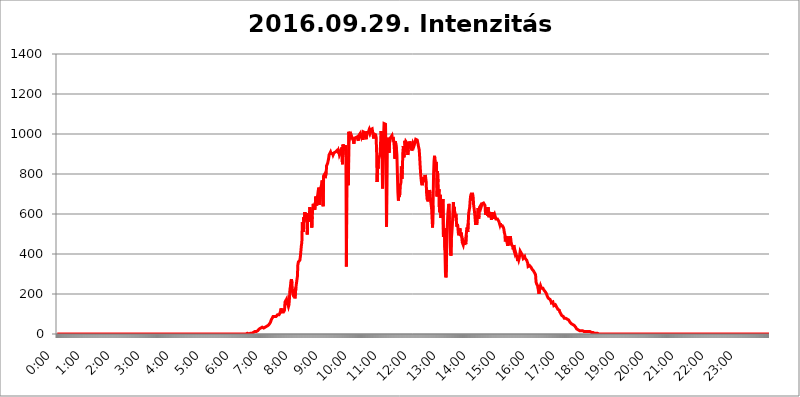
| Category | 2016.09.29. Intenzitás [W/m^2] |
|---|---|
| 0.0 | 0 |
| 0.0006944444444444445 | 0 |
| 0.001388888888888889 | 0 |
| 0.0020833333333333333 | 0 |
| 0.002777777777777778 | 0 |
| 0.003472222222222222 | 0 |
| 0.004166666666666667 | 0 |
| 0.004861111111111111 | 0 |
| 0.005555555555555556 | 0 |
| 0.0062499999999999995 | 0 |
| 0.006944444444444444 | 0 |
| 0.007638888888888889 | 0 |
| 0.008333333333333333 | 0 |
| 0.009027777777777779 | 0 |
| 0.009722222222222222 | 0 |
| 0.010416666666666666 | 0 |
| 0.011111111111111112 | 0 |
| 0.011805555555555555 | 0 |
| 0.012499999999999999 | 0 |
| 0.013194444444444444 | 0 |
| 0.013888888888888888 | 0 |
| 0.014583333333333332 | 0 |
| 0.015277777777777777 | 0 |
| 0.015972222222222224 | 0 |
| 0.016666666666666666 | 0 |
| 0.017361111111111112 | 0 |
| 0.018055555555555557 | 0 |
| 0.01875 | 0 |
| 0.019444444444444445 | 0 |
| 0.02013888888888889 | 0 |
| 0.020833333333333332 | 0 |
| 0.02152777777777778 | 0 |
| 0.022222222222222223 | 0 |
| 0.02291666666666667 | 0 |
| 0.02361111111111111 | 0 |
| 0.024305555555555556 | 0 |
| 0.024999999999999998 | 0 |
| 0.025694444444444447 | 0 |
| 0.02638888888888889 | 0 |
| 0.027083333333333334 | 0 |
| 0.027777777777777776 | 0 |
| 0.02847222222222222 | 0 |
| 0.029166666666666664 | 0 |
| 0.029861111111111113 | 0 |
| 0.030555555555555555 | 0 |
| 0.03125 | 0 |
| 0.03194444444444445 | 0 |
| 0.03263888888888889 | 0 |
| 0.03333333333333333 | 0 |
| 0.034027777777777775 | 0 |
| 0.034722222222222224 | 0 |
| 0.035416666666666666 | 0 |
| 0.036111111111111115 | 0 |
| 0.03680555555555556 | 0 |
| 0.0375 | 0 |
| 0.03819444444444444 | 0 |
| 0.03888888888888889 | 0 |
| 0.03958333333333333 | 0 |
| 0.04027777777777778 | 0 |
| 0.04097222222222222 | 0 |
| 0.041666666666666664 | 0 |
| 0.042361111111111106 | 0 |
| 0.04305555555555556 | 0 |
| 0.043750000000000004 | 0 |
| 0.044444444444444446 | 0 |
| 0.04513888888888889 | 0 |
| 0.04583333333333334 | 0 |
| 0.04652777777777778 | 0 |
| 0.04722222222222222 | 0 |
| 0.04791666666666666 | 0 |
| 0.04861111111111111 | 0 |
| 0.049305555555555554 | 0 |
| 0.049999999999999996 | 0 |
| 0.05069444444444445 | 0 |
| 0.051388888888888894 | 0 |
| 0.052083333333333336 | 0 |
| 0.05277777777777778 | 0 |
| 0.05347222222222222 | 0 |
| 0.05416666666666667 | 0 |
| 0.05486111111111111 | 0 |
| 0.05555555555555555 | 0 |
| 0.05625 | 0 |
| 0.05694444444444444 | 0 |
| 0.057638888888888885 | 0 |
| 0.05833333333333333 | 0 |
| 0.05902777777777778 | 0 |
| 0.059722222222222225 | 0 |
| 0.06041666666666667 | 0 |
| 0.061111111111111116 | 0 |
| 0.06180555555555556 | 0 |
| 0.0625 | 0 |
| 0.06319444444444444 | 0 |
| 0.06388888888888888 | 0 |
| 0.06458333333333334 | 0 |
| 0.06527777777777778 | 0 |
| 0.06597222222222222 | 0 |
| 0.06666666666666667 | 0 |
| 0.06736111111111111 | 0 |
| 0.06805555555555555 | 0 |
| 0.06874999999999999 | 0 |
| 0.06944444444444443 | 0 |
| 0.07013888888888889 | 0 |
| 0.07083333333333333 | 0 |
| 0.07152777777777779 | 0 |
| 0.07222222222222223 | 0 |
| 0.07291666666666667 | 0 |
| 0.07361111111111111 | 0 |
| 0.07430555555555556 | 0 |
| 0.075 | 0 |
| 0.07569444444444444 | 0 |
| 0.0763888888888889 | 0 |
| 0.07708333333333334 | 0 |
| 0.07777777777777778 | 0 |
| 0.07847222222222222 | 0 |
| 0.07916666666666666 | 0 |
| 0.0798611111111111 | 0 |
| 0.08055555555555556 | 0 |
| 0.08125 | 0 |
| 0.08194444444444444 | 0 |
| 0.08263888888888889 | 0 |
| 0.08333333333333333 | 0 |
| 0.08402777777777777 | 0 |
| 0.08472222222222221 | 0 |
| 0.08541666666666665 | 0 |
| 0.08611111111111112 | 0 |
| 0.08680555555555557 | 0 |
| 0.08750000000000001 | 0 |
| 0.08819444444444445 | 0 |
| 0.08888888888888889 | 0 |
| 0.08958333333333333 | 0 |
| 0.09027777777777778 | 0 |
| 0.09097222222222222 | 0 |
| 0.09166666666666667 | 0 |
| 0.09236111111111112 | 0 |
| 0.09305555555555556 | 0 |
| 0.09375 | 0 |
| 0.09444444444444444 | 0 |
| 0.09513888888888888 | 0 |
| 0.09583333333333333 | 0 |
| 0.09652777777777777 | 0 |
| 0.09722222222222222 | 0 |
| 0.09791666666666667 | 0 |
| 0.09861111111111111 | 0 |
| 0.09930555555555555 | 0 |
| 0.09999999999999999 | 0 |
| 0.10069444444444443 | 0 |
| 0.1013888888888889 | 0 |
| 0.10208333333333335 | 0 |
| 0.10277777777777779 | 0 |
| 0.10347222222222223 | 0 |
| 0.10416666666666667 | 0 |
| 0.10486111111111111 | 0 |
| 0.10555555555555556 | 0 |
| 0.10625 | 0 |
| 0.10694444444444444 | 0 |
| 0.1076388888888889 | 0 |
| 0.10833333333333334 | 0 |
| 0.10902777777777778 | 0 |
| 0.10972222222222222 | 0 |
| 0.1111111111111111 | 0 |
| 0.11180555555555556 | 0 |
| 0.11180555555555556 | 0 |
| 0.1125 | 0 |
| 0.11319444444444444 | 0 |
| 0.11388888888888889 | 0 |
| 0.11458333333333333 | 0 |
| 0.11527777777777777 | 0 |
| 0.11597222222222221 | 0 |
| 0.11666666666666665 | 0 |
| 0.1173611111111111 | 0 |
| 0.11805555555555557 | 0 |
| 0.11944444444444445 | 0 |
| 0.12013888888888889 | 0 |
| 0.12083333333333333 | 0 |
| 0.12152777777777778 | 0 |
| 0.12222222222222223 | 0 |
| 0.12291666666666667 | 0 |
| 0.12291666666666667 | 0 |
| 0.12361111111111112 | 0 |
| 0.12430555555555556 | 0 |
| 0.125 | 0 |
| 0.12569444444444444 | 0 |
| 0.12638888888888888 | 0 |
| 0.12708333333333333 | 0 |
| 0.16875 | 0 |
| 0.12847222222222224 | 0 |
| 0.12916666666666668 | 0 |
| 0.12986111111111112 | 0 |
| 0.13055555555555556 | 0 |
| 0.13125 | 0 |
| 0.13194444444444445 | 0 |
| 0.1326388888888889 | 0 |
| 0.13333333333333333 | 0 |
| 0.13402777777777777 | 0 |
| 0.13402777777777777 | 0 |
| 0.13472222222222222 | 0 |
| 0.13541666666666666 | 0 |
| 0.1361111111111111 | 0 |
| 0.13749999999999998 | 0 |
| 0.13819444444444443 | 0 |
| 0.1388888888888889 | 0 |
| 0.13958333333333334 | 0 |
| 0.14027777777777778 | 0 |
| 0.14097222222222222 | 0 |
| 0.14166666666666666 | 0 |
| 0.1423611111111111 | 0 |
| 0.14305555555555557 | 0 |
| 0.14375000000000002 | 0 |
| 0.14444444444444446 | 0 |
| 0.1451388888888889 | 0 |
| 0.1451388888888889 | 0 |
| 0.14652777777777778 | 0 |
| 0.14722222222222223 | 0 |
| 0.14791666666666667 | 0 |
| 0.1486111111111111 | 0 |
| 0.14930555555555555 | 0 |
| 0.15 | 0 |
| 0.15069444444444444 | 0 |
| 0.15138888888888888 | 0 |
| 0.15208333333333332 | 0 |
| 0.15277777777777776 | 0 |
| 0.15347222222222223 | 0 |
| 0.15416666666666667 | 0 |
| 0.15486111111111112 | 0 |
| 0.15555555555555556 | 0 |
| 0.15625 | 0 |
| 0.15694444444444444 | 0 |
| 0.15763888888888888 | 0 |
| 0.15833333333333333 | 0 |
| 0.15902777777777777 | 0 |
| 0.15972222222222224 | 0 |
| 0.16041666666666668 | 0 |
| 0.16111111111111112 | 0 |
| 0.16180555555555556 | 0 |
| 0.1625 | 0 |
| 0.16319444444444445 | 0 |
| 0.1638888888888889 | 0 |
| 0.16458333333333333 | 0 |
| 0.16527777777777777 | 0 |
| 0.16597222222222222 | 0 |
| 0.16666666666666666 | 0 |
| 0.1673611111111111 | 0 |
| 0.16805555555555554 | 0 |
| 0.16874999999999998 | 0 |
| 0.16944444444444443 | 0 |
| 0.17013888888888887 | 0 |
| 0.1708333333333333 | 0 |
| 0.17152777777777775 | 0 |
| 0.17222222222222225 | 0 |
| 0.1729166666666667 | 0 |
| 0.17361111111111113 | 0 |
| 0.17430555555555557 | 0 |
| 0.17500000000000002 | 0 |
| 0.17569444444444446 | 0 |
| 0.1763888888888889 | 0 |
| 0.17708333333333334 | 0 |
| 0.17777777777777778 | 0 |
| 0.17847222222222223 | 0 |
| 0.17916666666666667 | 0 |
| 0.1798611111111111 | 0 |
| 0.18055555555555555 | 0 |
| 0.18125 | 0 |
| 0.18194444444444444 | 0 |
| 0.1826388888888889 | 0 |
| 0.18333333333333335 | 0 |
| 0.1840277777777778 | 0 |
| 0.18472222222222223 | 0 |
| 0.18541666666666667 | 0 |
| 0.18611111111111112 | 0 |
| 0.18680555555555556 | 0 |
| 0.1875 | 0 |
| 0.18819444444444444 | 0 |
| 0.18888888888888888 | 0 |
| 0.18958333333333333 | 0 |
| 0.19027777777777777 | 0 |
| 0.1909722222222222 | 0 |
| 0.19166666666666665 | 0 |
| 0.19236111111111112 | 0 |
| 0.19305555555555554 | 0 |
| 0.19375 | 0 |
| 0.19444444444444445 | 0 |
| 0.1951388888888889 | 0 |
| 0.19583333333333333 | 0 |
| 0.19652777777777777 | 0 |
| 0.19722222222222222 | 0 |
| 0.19791666666666666 | 0 |
| 0.1986111111111111 | 0 |
| 0.19930555555555554 | 0 |
| 0.19999999999999998 | 0 |
| 0.20069444444444443 | 0 |
| 0.20138888888888887 | 0 |
| 0.2020833333333333 | 0 |
| 0.2027777777777778 | 0 |
| 0.2034722222222222 | 0 |
| 0.2041666666666667 | 0 |
| 0.20486111111111113 | 0 |
| 0.20555555555555557 | 0 |
| 0.20625000000000002 | 0 |
| 0.20694444444444446 | 0 |
| 0.2076388888888889 | 0 |
| 0.20833333333333334 | 0 |
| 0.20902777777777778 | 0 |
| 0.20972222222222223 | 0 |
| 0.21041666666666667 | 0 |
| 0.2111111111111111 | 0 |
| 0.21180555555555555 | 0 |
| 0.2125 | 0 |
| 0.21319444444444444 | 0 |
| 0.2138888888888889 | 0 |
| 0.21458333333333335 | 0 |
| 0.2152777777777778 | 0 |
| 0.21597222222222223 | 0 |
| 0.21666666666666667 | 0 |
| 0.21736111111111112 | 0 |
| 0.21805555555555556 | 0 |
| 0.21875 | 0 |
| 0.21944444444444444 | 0 |
| 0.22013888888888888 | 0 |
| 0.22083333333333333 | 0 |
| 0.22152777777777777 | 0 |
| 0.2222222222222222 | 0 |
| 0.22291666666666665 | 0 |
| 0.2236111111111111 | 0 |
| 0.22430555555555556 | 0 |
| 0.225 | 0 |
| 0.22569444444444445 | 0 |
| 0.2263888888888889 | 0 |
| 0.22708333333333333 | 0 |
| 0.22777777777777777 | 0 |
| 0.22847222222222222 | 0 |
| 0.22916666666666666 | 0 |
| 0.2298611111111111 | 0 |
| 0.23055555555555554 | 0 |
| 0.23124999999999998 | 0 |
| 0.23194444444444443 | 0 |
| 0.23263888888888887 | 0 |
| 0.2333333333333333 | 0 |
| 0.2340277777777778 | 0 |
| 0.2347222222222222 | 0 |
| 0.2354166666666667 | 0 |
| 0.23611111111111113 | 0 |
| 0.23680555555555557 | 0 |
| 0.23750000000000002 | 0 |
| 0.23819444444444446 | 0 |
| 0.2388888888888889 | 0 |
| 0.23958333333333334 | 0 |
| 0.24027777777777778 | 0 |
| 0.24097222222222223 | 0 |
| 0.24166666666666667 | 0 |
| 0.2423611111111111 | 0 |
| 0.24305555555555555 | 0 |
| 0.24375 | 0 |
| 0.24444444444444446 | 0 |
| 0.24513888888888888 | 0 |
| 0.24583333333333335 | 0 |
| 0.2465277777777778 | 0 |
| 0.24722222222222223 | 0 |
| 0.24791666666666667 | 0 |
| 0.24861111111111112 | 0 |
| 0.24930555555555556 | 0 |
| 0.25 | 0 |
| 0.25069444444444444 | 0 |
| 0.2513888888888889 | 0 |
| 0.2520833333333333 | 0 |
| 0.25277777777777777 | 0 |
| 0.2534722222222222 | 0 |
| 0.25416666666666665 | 0 |
| 0.2548611111111111 | 0 |
| 0.2555555555555556 | 0 |
| 0.25625000000000003 | 0 |
| 0.2569444444444445 | 0 |
| 0.2576388888888889 | 0 |
| 0.25833333333333336 | 0 |
| 0.2590277777777778 | 0 |
| 0.25972222222222224 | 0 |
| 0.2604166666666667 | 0 |
| 0.2611111111111111 | 0 |
| 0.26180555555555557 | 0 |
| 0.2625 | 0 |
| 0.26319444444444445 | 0 |
| 0.2638888888888889 | 0 |
| 0.26458333333333334 | 0 |
| 0.2652777777777778 | 0 |
| 0.2659722222222222 | 0 |
| 0.26666666666666666 | 3.525 |
| 0.2673611111111111 | 0 |
| 0.26805555555555555 | 0 |
| 0.26875 | 0 |
| 0.26944444444444443 | 0 |
| 0.2701388888888889 | 3.525 |
| 0.2708333333333333 | 3.525 |
| 0.27152777777777776 | 3.525 |
| 0.2722222222222222 | 3.525 |
| 0.27291666666666664 | 3.525 |
| 0.2736111111111111 | 3.525 |
| 0.2743055555555555 | 7.887 |
| 0.27499999999999997 | 7.887 |
| 0.27569444444444446 | 7.887 |
| 0.27638888888888885 | 12.257 |
| 0.27708333333333335 | 12.257 |
| 0.2777777777777778 | 12.257 |
| 0.27847222222222223 | 12.257 |
| 0.2791666666666667 | 12.257 |
| 0.2798611111111111 | 16.636 |
| 0.28055555555555556 | 16.636 |
| 0.28125 | 16.636 |
| 0.28194444444444444 | 16.636 |
| 0.2826388888888889 | 21.024 |
| 0.2833333333333333 | 25.419 |
| 0.28402777777777777 | 25.419 |
| 0.2847222222222222 | 25.419 |
| 0.28541666666666665 | 29.823 |
| 0.28611111111111115 | 29.823 |
| 0.28680555555555554 | 29.823 |
| 0.28750000000000003 | 34.234 |
| 0.2881944444444445 | 34.234 |
| 0.2888888888888889 | 29.823 |
| 0.28958333333333336 | 29.823 |
| 0.2902777777777778 | 29.823 |
| 0.29097222222222224 | 29.823 |
| 0.2916666666666667 | 34.234 |
| 0.2923611111111111 | 34.234 |
| 0.29305555555555557 | 34.234 |
| 0.29375 | 38.653 |
| 0.29444444444444445 | 38.653 |
| 0.2951388888888889 | 43.079 |
| 0.29583333333333334 | 43.079 |
| 0.2965277777777778 | 47.511 |
| 0.2972222222222222 | 47.511 |
| 0.29791666666666666 | 51.951 |
| 0.2986111111111111 | 56.398 |
| 0.29930555555555555 | 60.85 |
| 0.3 | 69.775 |
| 0.30069444444444443 | 74.246 |
| 0.3013888888888889 | 78.722 |
| 0.3020833333333333 | 83.205 |
| 0.30277777777777776 | 87.692 |
| 0.3034722222222222 | 83.205 |
| 0.30416666666666664 | 83.205 |
| 0.3048611111111111 | 87.692 |
| 0.3055555555555555 | 83.205 |
| 0.30624999999999997 | 83.205 |
| 0.3069444444444444 | 87.692 |
| 0.3076388888888889 | 87.692 |
| 0.30833333333333335 | 92.184 |
| 0.3090277777777778 | 96.682 |
| 0.30972222222222223 | 101.184 |
| 0.3104166666666667 | 96.682 |
| 0.3111111111111111 | 96.682 |
| 0.31180555555555556 | 96.682 |
| 0.3125 | 105.69 |
| 0.31319444444444444 | 114.716 |
| 0.3138888888888889 | 128.284 |
| 0.3145833333333333 | 128.284 |
| 0.31527777777777777 | 110.201 |
| 0.3159722222222222 | 105.69 |
| 0.31666666666666665 | 110.201 |
| 0.31736111111111115 | 110.201 |
| 0.31805555555555554 | 110.201 |
| 0.31875000000000003 | 119.235 |
| 0.3194444444444445 | 160.056 |
| 0.3201388888888889 | 160.056 |
| 0.32083333333333336 | 164.605 |
| 0.3215277777777778 | 173.709 |
| 0.32222222222222224 | 155.509 |
| 0.3229166666666667 | 155.509 |
| 0.3236111111111111 | 146.423 |
| 0.32430555555555557 | 137.347 |
| 0.325 | 146.423 |
| 0.32569444444444445 | 178.264 |
| 0.3263888888888889 | 223.873 |
| 0.32708333333333334 | 237.564 |
| 0.3277777777777778 | 264.932 |
| 0.3284722222222222 | 274.047 |
| 0.32916666666666666 | 255.813 |
| 0.3298611111111111 | 210.182 |
| 0.33055555555555555 | 201.058 |
| 0.33125 | 205.62 |
| 0.33194444444444443 | 210.182 |
| 0.3326388888888889 | 196.497 |
| 0.3333333333333333 | 178.264 |
| 0.3340277777777778 | 173.709 |
| 0.3347222222222222 | 233 |
| 0.3354166666666667 | 228.436 |
| 0.3361111111111111 | 228.436 |
| 0.3368055555555556 | 287.709 |
| 0.33749999999999997 | 346.682 |
| 0.33819444444444446 | 360.221 |
| 0.33888888888888885 | 355.712 |
| 0.33958333333333335 | 355.712 |
| 0.34027777777777773 | 369.23 |
| 0.34097222222222223 | 387.202 |
| 0.3416666666666666 | 387.202 |
| 0.3423611111111111 | 440.702 |
| 0.3430555555555555 | 458.38 |
| 0.34375 | 558.261 |
| 0.3444444444444445 | 558.261 |
| 0.3451388888888889 | 510.885 |
| 0.3458333333333334 | 583.779 |
| 0.34652777777777777 | 562.53 |
| 0.34722222222222227 | 609.062 |
| 0.34791666666666665 | 609.062 |
| 0.34861111111111115 | 583.779 |
| 0.34930555555555554 | 600.661 |
| 0.35000000000000003 | 579.542 |
| 0.3506944444444444 | 497.836 |
| 0.3513888888888889 | 604.864 |
| 0.3520833333333333 | 609.062 |
| 0.3527777777777778 | 562.53 |
| 0.3534722222222222 | 571.049 |
| 0.3541666666666667 | 634.105 |
| 0.3548611111111111 | 617.436 |
| 0.35555555555555557 | 583.779 |
| 0.35625 | 592.233 |
| 0.35694444444444445 | 532.513 |
| 0.3576388888888889 | 588.009 |
| 0.35833333333333334 | 625.784 |
| 0.3590277777777778 | 650.667 |
| 0.3597222222222222 | 638.256 |
| 0.36041666666666666 | 650.667 |
| 0.3611111111111111 | 621.613 |
| 0.36180555555555555 | 646.537 |
| 0.3625 | 687.544 |
| 0.36319444444444443 | 683.473 |
| 0.3638888888888889 | 642.4 |
| 0.3645833333333333 | 679.395 |
| 0.3652777777777778 | 695.666 |
| 0.3659722222222222 | 691.608 |
| 0.3666666666666667 | 731.896 |
| 0.3673611111111111 | 727.896 |
| 0.3680555555555556 | 646.537 |
| 0.36874999999999997 | 711.832 |
| 0.36944444444444446 | 727.896 |
| 0.37013888888888885 | 727.896 |
| 0.37083333333333335 | 747.834 |
| 0.37152777777777773 | 767.62 |
| 0.37222222222222223 | 687.544 |
| 0.3729166666666666 | 638.256 |
| 0.3736111111111111 | 791.169 |
| 0.3743055555555555 | 791.169 |
| 0.375 | 798.974 |
| 0.3756944444444445 | 779.42 |
| 0.3763888888888889 | 791.169 |
| 0.3770833333333334 | 798.974 |
| 0.37777777777777777 | 841.526 |
| 0.37847222222222227 | 837.682 |
| 0.37916666666666665 | 853.029 |
| 0.37986111111111115 | 864.493 |
| 0.38055555555555554 | 875.918 |
| 0.38125000000000003 | 894.885 |
| 0.3819444444444444 | 898.668 |
| 0.3826388888888889 | 898.668 |
| 0.3833333333333333 | 909.996 |
| 0.3840277777777778 | 902.447 |
| 0.3847222222222222 | 902.447 |
| 0.3854166666666667 | 898.668 |
| 0.3861111111111111 | 902.447 |
| 0.38680555555555557 | 894.885 |
| 0.3875 | 898.668 |
| 0.38819444444444445 | 906.223 |
| 0.3888888888888889 | 902.447 |
| 0.38958333333333334 | 909.996 |
| 0.3902777777777778 | 909.996 |
| 0.3909722222222222 | 909.996 |
| 0.39166666666666666 | 913.766 |
| 0.3923611111111111 | 917.534 |
| 0.39305555555555555 | 913.766 |
| 0.39375 | 909.996 |
| 0.39444444444444443 | 917.534 |
| 0.3951388888888889 | 909.996 |
| 0.3958333333333333 | 894.885 |
| 0.3965277777777778 | 898.668 |
| 0.3972222222222222 | 906.223 |
| 0.3979166666666667 | 913.766 |
| 0.3986111111111111 | 925.06 |
| 0.3993055555555556 | 932.576 |
| 0.39999999999999997 | 849.199 |
| 0.40069444444444446 | 947.58 |
| 0.40138888888888885 | 943.832 |
| 0.40208333333333335 | 932.576 |
| 0.40277777777777773 | 917.534 |
| 0.40347222222222223 | 925.06 |
| 0.4041666666666666 | 943.832 |
| 0.4048611111111111 | 894.885 |
| 0.4055555555555555 | 337.639 |
| 0.40625 | 887.309 |
| 0.4069444444444445 | 810.641 |
| 0.4076388888888889 | 755.766 |
| 0.4083333333333334 | 743.859 |
| 0.40902777777777777 | 1011.118 |
| 0.40972222222222227 | 999.916 |
| 0.41041666666666665 | 1003.65 |
| 0.41111111111111115 | 992.448 |
| 0.41180555555555554 | 984.98 |
| 0.41250000000000003 | 992.448 |
| 0.4131944444444444 | 984.98 |
| 0.4138888888888889 | 984.98 |
| 0.4145833333333333 | 977.508 |
| 0.4152777777777778 | 970.034 |
| 0.4159722222222222 | 951.327 |
| 0.4166666666666667 | 973.772 |
| 0.4173611111111111 | 977.508 |
| 0.41805555555555557 | 981.244 |
| 0.41875 | 981.244 |
| 0.41944444444444445 | 977.508 |
| 0.4201388888888889 | 984.98 |
| 0.42083333333333334 | 981.244 |
| 0.4215277777777778 | 988.714 |
| 0.4222222222222222 | 966.295 |
| 0.42291666666666666 | 992.448 |
| 0.4236111111111111 | 996.182 |
| 0.42430555555555555 | 996.182 |
| 0.425 | 1003.65 |
| 0.42569444444444443 | 992.448 |
| 0.4263888888888889 | 984.98 |
| 0.4270833333333333 | 988.714 |
| 0.4277777777777778 | 1003.65 |
| 0.4284722222222222 | 970.034 |
| 0.4291666666666667 | 1011.118 |
| 0.4298611111111111 | 1007.383 |
| 0.4305555555555556 | 1007.383 |
| 0.43124999999999997 | 1007.383 |
| 0.43194444444444446 | 1007.383 |
| 0.43263888888888885 | 1011.118 |
| 0.43333333333333335 | 973.772 |
| 0.43402777777777773 | 1007.383 |
| 0.43472222222222223 | 1007.383 |
| 0.4354166666666666 | 1003.65 |
| 0.4361111111111111 | 1007.383 |
| 0.4368055555555555 | 1014.852 |
| 0.4375 | 1007.383 |
| 0.4381944444444445 | 1018.587 |
| 0.4388888888888889 | 1011.118 |
| 0.4395833333333334 | 1022.323 |
| 0.44027777777777777 | 1026.06 |
| 0.44097222222222227 | 1022.323 |
| 0.44166666666666665 | 1026.06 |
| 0.44236111111111115 | 1026.06 |
| 0.44305555555555554 | 1022.323 |
| 0.44375000000000003 | 977.508 |
| 0.4444444444444444 | 999.916 |
| 0.4451388888888889 | 1003.65 |
| 0.4458333333333333 | 996.182 |
| 0.4465277777777778 | 996.182 |
| 0.4472222222222222 | 984.98 |
| 0.4479166666666667 | 913.766 |
| 0.4486111111111111 | 759.723 |
| 0.44930555555555557 | 837.682 |
| 0.45 | 826.123 |
| 0.45069444444444445 | 875.918 |
| 0.4513888888888889 | 883.516 |
| 0.45208333333333334 | 887.309 |
| 0.4527777777777778 | 898.668 |
| 0.4534722222222222 | 955.071 |
| 0.45416666666666666 | 1014.852 |
| 0.4548611111111111 | 988.714 |
| 0.45555555555555555 | 883.516 |
| 0.45625 | 727.896 |
| 0.45694444444444443 | 928.819 |
| 0.4576388888888889 | 981.244 |
| 0.4583333333333333 | 1052.255 |
| 0.4590277777777778 | 1052.255 |
| 0.4597222222222222 | 1052.255 |
| 0.4604166666666667 | 1048.508 |
| 0.4611111111111111 | 856.855 |
| 0.4618055555555556 | 536.82 |
| 0.46249999999999997 | 906.223 |
| 0.46319444444444446 | 977.508 |
| 0.46388888888888885 | 917.534 |
| 0.46458333333333335 | 981.244 |
| 0.46527777777777773 | 906.223 |
| 0.46597222222222223 | 955.071 |
| 0.4666666666666666 | 962.555 |
| 0.4673611111111111 | 981.244 |
| 0.4680555555555555 | 984.98 |
| 0.46875 | 977.508 |
| 0.4694444444444445 | 992.448 |
| 0.4701388888888889 | 973.772 |
| 0.4708333333333334 | 984.98 |
| 0.47152777777777777 | 981.244 |
| 0.47222222222222227 | 958.814 |
| 0.47291666666666665 | 921.298 |
| 0.47361111111111115 | 875.918 |
| 0.47430555555555554 | 962.555 |
| 0.47500000000000003 | 962.555 |
| 0.4756944444444444 | 925.06 |
| 0.4763888888888889 | 894.885 |
| 0.4770833333333333 | 798.974 |
| 0.4777777777777778 | 707.8 |
| 0.4784722222222222 | 667.123 |
| 0.4791666666666667 | 699.717 |
| 0.4798611111111111 | 687.544 |
| 0.48055555555555557 | 703.762 |
| 0.48125 | 743.859 |
| 0.48194444444444445 | 755.766 |
| 0.4826388888888889 | 837.682 |
| 0.48333333333333334 | 775.492 |
| 0.4840277777777778 | 822.26 |
| 0.4847222222222222 | 906.223 |
| 0.48541666666666666 | 940.082 |
| 0.4861111111111111 | 883.516 |
| 0.48680555555555555 | 902.447 |
| 0.4875 | 966.295 |
| 0.48819444444444443 | 947.58 |
| 0.4888888888888889 | 962.555 |
| 0.4895833333333333 | 962.555 |
| 0.4902777777777778 | 955.071 |
| 0.4909722222222222 | 928.819 |
| 0.4916666666666667 | 894.885 |
| 0.4923611111111111 | 921.298 |
| 0.4930555555555556 | 951.327 |
| 0.49374999999999997 | 940.082 |
| 0.49444444444444446 | 962.555 |
| 0.49513888888888885 | 955.071 |
| 0.49583333333333335 | 943.832 |
| 0.49652777777777773 | 917.534 |
| 0.49722222222222223 | 925.06 |
| 0.4979166666666666 | 940.082 |
| 0.4986111111111111 | 951.327 |
| 0.4993055555555555 | 951.327 |
| 0.5 | 936.33 |
| 0.5006944444444444 | 943.832 |
| 0.5013888888888889 | 955.071 |
| 0.5020833333333333 | 951.327 |
| 0.5027777777777778 | 973.772 |
| 0.5034722222222222 | 973.772 |
| 0.5041666666666667 | 970.034 |
| 0.5048611111111111 | 970.034 |
| 0.5055555555555555 | 958.814 |
| 0.50625 | 955.071 |
| 0.5069444444444444 | 932.576 |
| 0.5076388888888889 | 921.298 |
| 0.5083333333333333 | 883.516 |
| 0.5090277777777777 | 837.682 |
| 0.5097222222222222 | 798.974 |
| 0.5104166666666666 | 771.559 |
| 0.5111111111111112 | 751.803 |
| 0.5118055555555555 | 743.859 |
| 0.5125000000000001 | 739.877 |
| 0.5131944444444444 | 747.834 |
| 0.513888888888889 | 783.342 |
| 0.5145833333333333 | 759.723 |
| 0.5152777777777778 | 759.723 |
| 0.5159722222222222 | 795.074 |
| 0.5166666666666667 | 783.342 |
| 0.517361111111111 | 763.674 |
| 0.5180555555555556 | 703.762 |
| 0.5187499999999999 | 675.311 |
| 0.5194444444444445 | 679.395 |
| 0.5201388888888888 | 663.019 |
| 0.5208333333333334 | 683.473 |
| 0.5215277777777778 | 687.544 |
| 0.5222222222222223 | 719.877 |
| 0.5229166666666667 | 703.762 |
| 0.5236111111111111 | 667.123 |
| 0.5243055555555556 | 671.22 |
| 0.525 | 629.948 |
| 0.5256944444444445 | 579.542 |
| 0.5263888888888889 | 532.513 |
| 0.5270833333333333 | 642.4 |
| 0.5277777777777778 | 795.074 |
| 0.5284722222222222 | 864.493 |
| 0.5291666666666667 | 891.099 |
| 0.5298611111111111 | 860.676 |
| 0.5305555555555556 | 849.199 |
| 0.53125 | 860.676 |
| 0.5319444444444444 | 845.365 |
| 0.5326388888888889 | 687.544 |
| 0.5333333333333333 | 814.519 |
| 0.5340277777777778 | 759.723 |
| 0.5347222222222222 | 707.8 |
| 0.5354166666666667 | 723.889 |
| 0.5361111111111111 | 609.062 |
| 0.5368055555555555 | 646.537 |
| 0.5375 | 695.666 |
| 0.5381944444444444 | 579.542 |
| 0.5388888888888889 | 667.123 |
| 0.5395833333333333 | 629.948 |
| 0.5402777777777777 | 650.667 |
| 0.5409722222222222 | 675.311 |
| 0.5416666666666666 | 484.735 |
| 0.5423611111111112 | 497.836 |
| 0.5430555555555555 | 528.2 |
| 0.5437500000000001 | 418.492 |
| 0.5444444444444444 | 305.898 |
| 0.545138888888889 | 283.156 |
| 0.5458333333333333 | 346.682 |
| 0.5465277777777778 | 497.836 |
| 0.5472222222222222 | 553.986 |
| 0.5479166666666667 | 604.864 |
| 0.548611111111111 | 629.948 |
| 0.5493055555555556 | 650.667 |
| 0.5499999999999999 | 575.299 |
| 0.5506944444444445 | 523.88 |
| 0.5513888888888888 | 431.833 |
| 0.5520833333333334 | 391.685 |
| 0.5527777777777778 | 475.972 |
| 0.5534722222222223 | 506.542 |
| 0.5541666666666667 | 545.416 |
| 0.5548611111111111 | 600.661 |
| 0.5555555555555556 | 658.909 |
| 0.55625 | 621.613 |
| 0.5569444444444445 | 634.105 |
| 0.5576388888888889 | 596.45 |
| 0.5583333333333333 | 583.779 |
| 0.5590277777777778 | 600.661 |
| 0.5597222222222222 | 566.793 |
| 0.5604166666666667 | 536.82 |
| 0.5611111111111111 | 549.704 |
| 0.5618055555555556 | 536.82 |
| 0.5625 | 506.542 |
| 0.5631944444444444 | 493.475 |
| 0.5638888888888889 | 493.475 |
| 0.5645833333333333 | 528.2 |
| 0.5652777777777778 | 515.223 |
| 0.5659722222222222 | 489.108 |
| 0.5666666666666667 | 506.542 |
| 0.5673611111111111 | 484.735 |
| 0.5680555555555555 | 458.38 |
| 0.56875 | 453.968 |
| 0.5694444444444444 | 445.129 |
| 0.5701388888888889 | 458.38 |
| 0.5708333333333333 | 458.38 |
| 0.5715277777777777 | 445.129 |
| 0.5722222222222222 | 467.187 |
| 0.5729166666666666 | 449.551 |
| 0.5736111111111112 | 493.475 |
| 0.5743055555555555 | 523.88 |
| 0.5750000000000001 | 532.513 |
| 0.5756944444444444 | 510.885 |
| 0.576388888888889 | 553.986 |
| 0.5770833333333333 | 604.864 |
| 0.5777777777777778 | 609.062 |
| 0.5784722222222222 | 634.105 |
| 0.5791666666666667 | 671.22 |
| 0.579861111111111 | 691.608 |
| 0.5805555555555556 | 699.717 |
| 0.5812499999999999 | 695.666 |
| 0.5819444444444445 | 703.762 |
| 0.5826388888888888 | 699.717 |
| 0.5833333333333334 | 683.473 |
| 0.5840277777777778 | 642.4 |
| 0.5847222222222223 | 625.784 |
| 0.5854166666666667 | 604.864 |
| 0.5861111111111111 | 600.661 |
| 0.5868055555555556 | 545.416 |
| 0.5875 | 583.779 |
| 0.5881944444444445 | 545.416 |
| 0.5888888888888889 | 562.53 |
| 0.5895833333333333 | 596.45 |
| 0.5902777777777778 | 629.948 |
| 0.5909722222222222 | 575.299 |
| 0.5916666666666667 | 592.233 |
| 0.5923611111111111 | 634.105 |
| 0.5930555555555556 | 634.105 |
| 0.59375 | 642.4 |
| 0.5944444444444444 | 634.105 |
| 0.5951388888888889 | 634.105 |
| 0.5958333333333333 | 650.667 |
| 0.5965277777777778 | 654.791 |
| 0.5972222222222222 | 654.791 |
| 0.5979166666666667 | 654.791 |
| 0.5986111111111111 | 654.791 |
| 0.5993055555555555 | 658.909 |
| 0.6 | 642.4 |
| 0.6006944444444444 | 596.45 |
| 0.6013888888888889 | 609.062 |
| 0.6020833333333333 | 634.105 |
| 0.6027777777777777 | 613.252 |
| 0.6034722222222222 | 592.233 |
| 0.6041666666666666 | 634.105 |
| 0.6048611111111112 | 604.864 |
| 0.6055555555555555 | 583.779 |
| 0.6062500000000001 | 609.062 |
| 0.6069444444444444 | 613.252 |
| 0.607638888888889 | 596.45 |
| 0.6083333333333333 | 583.779 |
| 0.6090277777777778 | 571.049 |
| 0.6097222222222222 | 609.062 |
| 0.6104166666666667 | 592.233 |
| 0.611111111111111 | 575.299 |
| 0.6118055555555556 | 592.233 |
| 0.6124999999999999 | 588.009 |
| 0.6131944444444445 | 600.661 |
| 0.6138888888888888 | 592.233 |
| 0.6145833333333334 | 588.009 |
| 0.6152777777777778 | 575.299 |
| 0.6159722222222223 | 575.299 |
| 0.6166666666666667 | 575.299 |
| 0.6173611111111111 | 575.299 |
| 0.6180555555555556 | 575.299 |
| 0.61875 | 571.049 |
| 0.6194444444444445 | 562.53 |
| 0.6201388888888889 | 562.53 |
| 0.6208333333333333 | 545.416 |
| 0.6215277777777778 | 553.986 |
| 0.6222222222222222 | 541.121 |
| 0.6229166666666667 | 541.121 |
| 0.6236111111111111 | 541.121 |
| 0.6243055555555556 | 541.121 |
| 0.625 | 536.82 |
| 0.6256944444444444 | 532.513 |
| 0.6263888888888889 | 523.88 |
| 0.6270833333333333 | 506.542 |
| 0.6277777777777778 | 497.836 |
| 0.6284722222222222 | 462.786 |
| 0.6291666666666667 | 489.108 |
| 0.6298611111111111 | 475.972 |
| 0.6305555555555555 | 480.356 |
| 0.63125 | 489.108 |
| 0.6319444444444444 | 440.702 |
| 0.6326388888888889 | 458.38 |
| 0.6333333333333333 | 462.786 |
| 0.6340277777777777 | 462.786 |
| 0.6347222222222222 | 453.968 |
| 0.6354166666666666 | 489.108 |
| 0.6361111111111112 | 471.582 |
| 0.6368055555555555 | 453.968 |
| 0.6375000000000001 | 445.129 |
| 0.6381944444444444 | 445.129 |
| 0.638888888888889 | 436.27 |
| 0.6395833333333333 | 422.943 |
| 0.6402777777777778 | 445.129 |
| 0.6409722222222222 | 414.035 |
| 0.6416666666666667 | 405.108 |
| 0.642361111111111 | 414.035 |
| 0.6430555555555556 | 409.574 |
| 0.6437499999999999 | 396.164 |
| 0.6444444444444445 | 387.202 |
| 0.6451388888888888 | 378.224 |
| 0.6458333333333334 | 364.728 |
| 0.6465277777777778 | 378.224 |
| 0.6472222222222223 | 369.23 |
| 0.6479166666666667 | 378.224 |
| 0.6486111111111111 | 373.729 |
| 0.6493055555555556 | 414.035 |
| 0.65 | 409.574 |
| 0.6506944444444445 | 405.108 |
| 0.6513888888888889 | 405.108 |
| 0.6520833333333333 | 396.164 |
| 0.6527777777777778 | 387.202 |
| 0.6534722222222222 | 378.224 |
| 0.6541666666666667 | 382.715 |
| 0.6548611111111111 | 378.224 |
| 0.6555555555555556 | 387.202 |
| 0.65625 | 378.224 |
| 0.6569444444444444 | 378.224 |
| 0.6576388888888889 | 373.729 |
| 0.6583333333333333 | 369.23 |
| 0.6590277777777778 | 364.728 |
| 0.6597222222222222 | 355.712 |
| 0.6604166666666667 | 337.639 |
| 0.6611111111111111 | 342.162 |
| 0.6618055555555555 | 342.162 |
| 0.6625 | 342.162 |
| 0.6631944444444444 | 342.162 |
| 0.6638888888888889 | 337.639 |
| 0.6645833333333333 | 333.113 |
| 0.6652777777777777 | 328.584 |
| 0.6659722222222222 | 324.052 |
| 0.6666666666666666 | 319.517 |
| 0.6673611111111111 | 319.517 |
| 0.6680555555555556 | 314.98 |
| 0.6687500000000001 | 310.44 |
| 0.6694444444444444 | 305.898 |
| 0.6701388888888888 | 305.898 |
| 0.6708333333333334 | 296.808 |
| 0.6715277777777778 | 260.373 |
| 0.6722222222222222 | 251.251 |
| 0.6729166666666666 | 246.689 |
| 0.6736111111111112 | 242.127 |
| 0.6743055555555556 | 237.564 |
| 0.6749999999999999 | 242.127 |
| 0.6756944444444444 | 201.058 |
| 0.6763888888888889 | 223.873 |
| 0.6770833333333334 | 228.436 |
| 0.6777777777777777 | 242.127 |
| 0.6784722222222223 | 242.127 |
| 0.6791666666666667 | 228.436 |
| 0.6798611111111111 | 228.436 |
| 0.6805555555555555 | 233 |
| 0.68125 | 228.436 |
| 0.6819444444444445 | 223.873 |
| 0.6826388888888889 | 219.309 |
| 0.6833333333333332 | 219.309 |
| 0.6840277777777778 | 214.746 |
| 0.6847222222222222 | 210.182 |
| 0.6854166666666667 | 205.62 |
| 0.686111111111111 | 201.058 |
| 0.6868055555555556 | 196.497 |
| 0.6875 | 187.378 |
| 0.6881944444444444 | 182.82 |
| 0.688888888888889 | 178.264 |
| 0.6895833333333333 | 178.264 |
| 0.6902777777777778 | 173.709 |
| 0.6909722222222222 | 173.709 |
| 0.6916666666666668 | 169.156 |
| 0.6923611111111111 | 164.605 |
| 0.6930555555555555 | 155.509 |
| 0.69375 | 155.509 |
| 0.6944444444444445 | 160.056 |
| 0.6951388888888889 | 160.056 |
| 0.6958333333333333 | 150.964 |
| 0.6965277777777777 | 141.884 |
| 0.6972222222222223 | 146.423 |
| 0.6979166666666666 | 146.423 |
| 0.6986111111111111 | 146.423 |
| 0.6993055555555556 | 141.884 |
| 0.7000000000000001 | 141.884 |
| 0.7006944444444444 | 132.814 |
| 0.7013888888888888 | 128.284 |
| 0.7020833333333334 | 123.758 |
| 0.7027777777777778 | 119.235 |
| 0.7034722222222222 | 119.235 |
| 0.7041666666666666 | 119.235 |
| 0.7048611111111112 | 110.201 |
| 0.7055555555555556 | 105.69 |
| 0.7062499999999999 | 101.184 |
| 0.7069444444444444 | 96.682 |
| 0.7076388888888889 | 92.184 |
| 0.7083333333333334 | 92.184 |
| 0.7090277777777777 | 87.692 |
| 0.7097222222222223 | 87.692 |
| 0.7104166666666667 | 83.205 |
| 0.7111111111111111 | 78.722 |
| 0.7118055555555555 | 78.722 |
| 0.7125 | 78.722 |
| 0.7131944444444445 | 78.722 |
| 0.7138888888888889 | 78.722 |
| 0.7145833333333332 | 74.246 |
| 0.7152777777777778 | 74.246 |
| 0.7159722222222222 | 74.246 |
| 0.7166666666666667 | 69.775 |
| 0.717361111111111 | 69.775 |
| 0.7180555555555556 | 65.31 |
| 0.71875 | 60.85 |
| 0.7194444444444444 | 56.398 |
| 0.720138888888889 | 56.398 |
| 0.7208333333333333 | 51.951 |
| 0.7215277777777778 | 47.511 |
| 0.7222222222222222 | 47.511 |
| 0.7229166666666668 | 47.511 |
| 0.7236111111111111 | 47.511 |
| 0.7243055555555555 | 47.511 |
| 0.725 | 43.079 |
| 0.7256944444444445 | 43.079 |
| 0.7263888888888889 | 38.653 |
| 0.7270833333333333 | 34.234 |
| 0.7277777777777777 | 29.823 |
| 0.7284722222222223 | 25.419 |
| 0.7291666666666666 | 21.024 |
| 0.7298611111111111 | 21.024 |
| 0.7305555555555556 | 21.024 |
| 0.7312500000000001 | 21.024 |
| 0.7319444444444444 | 21.024 |
| 0.7326388888888888 | 16.636 |
| 0.7333333333333334 | 16.636 |
| 0.7340277777777778 | 16.636 |
| 0.7347222222222222 | 16.636 |
| 0.7354166666666666 | 16.636 |
| 0.7361111111111112 | 16.636 |
| 0.7368055555555556 | 16.636 |
| 0.7374999999999999 | 12.257 |
| 0.7381944444444444 | 12.257 |
| 0.7388888888888889 | 12.257 |
| 0.7395833333333334 | 12.257 |
| 0.7402777777777777 | 12.257 |
| 0.7409722222222223 | 12.257 |
| 0.7416666666666667 | 12.257 |
| 0.7423611111111111 | 12.257 |
| 0.7430555555555555 | 12.257 |
| 0.74375 | 12.257 |
| 0.7444444444444445 | 12.257 |
| 0.7451388888888889 | 12.257 |
| 0.7458333333333332 | 12.257 |
| 0.7465277777777778 | 12.257 |
| 0.7472222222222222 | 12.257 |
| 0.7479166666666667 | 12.257 |
| 0.748611111111111 | 12.257 |
| 0.7493055555555556 | 7.887 |
| 0.75 | 7.887 |
| 0.7506944444444444 | 7.887 |
| 0.751388888888889 | 7.887 |
| 0.7520833333333333 | 7.887 |
| 0.7527777777777778 | 3.525 |
| 0.7534722222222222 | 3.525 |
| 0.7541666666666668 | 3.525 |
| 0.7548611111111111 | 3.525 |
| 0.7555555555555555 | 3.525 |
| 0.75625 | 3.525 |
| 0.7569444444444445 | 3.525 |
| 0.7576388888888889 | 3.525 |
| 0.7583333333333333 | 3.525 |
| 0.7590277777777777 | 3.525 |
| 0.7597222222222223 | 0 |
| 0.7604166666666666 | 0 |
| 0.7611111111111111 | 0 |
| 0.7618055555555556 | 0 |
| 0.7625000000000001 | 0 |
| 0.7631944444444444 | 0 |
| 0.7638888888888888 | 0 |
| 0.7645833333333334 | 0 |
| 0.7652777777777778 | 0 |
| 0.7659722222222222 | 0 |
| 0.7666666666666666 | 0 |
| 0.7673611111111112 | 0 |
| 0.7680555555555556 | 0 |
| 0.7687499999999999 | 0 |
| 0.7694444444444444 | 0 |
| 0.7701388888888889 | 0 |
| 0.7708333333333334 | 0 |
| 0.7715277777777777 | 0 |
| 0.7722222222222223 | 0 |
| 0.7729166666666667 | 0 |
| 0.7736111111111111 | 0 |
| 0.7743055555555555 | 0 |
| 0.775 | 0 |
| 0.7756944444444445 | 0 |
| 0.7763888888888889 | 0 |
| 0.7770833333333332 | 0 |
| 0.7777777777777778 | 0 |
| 0.7784722222222222 | 0 |
| 0.7791666666666667 | 0 |
| 0.779861111111111 | 0 |
| 0.7805555555555556 | 0 |
| 0.78125 | 0 |
| 0.7819444444444444 | 0 |
| 0.782638888888889 | 0 |
| 0.7833333333333333 | 0 |
| 0.7840277777777778 | 0 |
| 0.7847222222222222 | 0 |
| 0.7854166666666668 | 0 |
| 0.7861111111111111 | 0 |
| 0.7868055555555555 | 0 |
| 0.7875 | 0 |
| 0.7881944444444445 | 0 |
| 0.7888888888888889 | 0 |
| 0.7895833333333333 | 0 |
| 0.7902777777777777 | 0 |
| 0.7909722222222223 | 0 |
| 0.7916666666666666 | 0 |
| 0.7923611111111111 | 0 |
| 0.7930555555555556 | 0 |
| 0.7937500000000001 | 0 |
| 0.7944444444444444 | 0 |
| 0.7951388888888888 | 0 |
| 0.7958333333333334 | 0 |
| 0.7965277777777778 | 0 |
| 0.7972222222222222 | 0 |
| 0.7979166666666666 | 0 |
| 0.7986111111111112 | 0 |
| 0.7993055555555556 | 0 |
| 0.7999999999999999 | 0 |
| 0.8006944444444444 | 0 |
| 0.8013888888888889 | 0 |
| 0.8020833333333334 | 0 |
| 0.8027777777777777 | 0 |
| 0.8034722222222223 | 0 |
| 0.8041666666666667 | 0 |
| 0.8048611111111111 | 0 |
| 0.8055555555555555 | 0 |
| 0.80625 | 0 |
| 0.8069444444444445 | 0 |
| 0.8076388888888889 | 0 |
| 0.8083333333333332 | 0 |
| 0.8090277777777778 | 0 |
| 0.8097222222222222 | 0 |
| 0.8104166666666667 | 0 |
| 0.811111111111111 | 0 |
| 0.8118055555555556 | 0 |
| 0.8125 | 0 |
| 0.8131944444444444 | 0 |
| 0.813888888888889 | 0 |
| 0.8145833333333333 | 0 |
| 0.8152777777777778 | 0 |
| 0.8159722222222222 | 0 |
| 0.8166666666666668 | 0 |
| 0.8173611111111111 | 0 |
| 0.8180555555555555 | 0 |
| 0.81875 | 0 |
| 0.8194444444444445 | 0 |
| 0.8201388888888889 | 0 |
| 0.8208333333333333 | 0 |
| 0.8215277777777777 | 0 |
| 0.8222222222222223 | 0 |
| 0.8229166666666666 | 0 |
| 0.8236111111111111 | 0 |
| 0.8243055555555556 | 0 |
| 0.8250000000000001 | 0 |
| 0.8256944444444444 | 0 |
| 0.8263888888888888 | 0 |
| 0.8270833333333334 | 0 |
| 0.8277777777777778 | 0 |
| 0.8284722222222222 | 0 |
| 0.8291666666666666 | 0 |
| 0.8298611111111112 | 0 |
| 0.8305555555555556 | 0 |
| 0.8312499999999999 | 0 |
| 0.8319444444444444 | 0 |
| 0.8326388888888889 | 0 |
| 0.8333333333333334 | 0 |
| 0.8340277777777777 | 0 |
| 0.8347222222222223 | 0 |
| 0.8354166666666667 | 0 |
| 0.8361111111111111 | 0 |
| 0.8368055555555555 | 0 |
| 0.8375 | 0 |
| 0.8381944444444445 | 0 |
| 0.8388888888888889 | 0 |
| 0.8395833333333332 | 0 |
| 0.8402777777777778 | 0 |
| 0.8409722222222222 | 0 |
| 0.8416666666666667 | 0 |
| 0.842361111111111 | 0 |
| 0.8430555555555556 | 0 |
| 0.84375 | 0 |
| 0.8444444444444444 | 0 |
| 0.845138888888889 | 0 |
| 0.8458333333333333 | 0 |
| 0.8465277777777778 | 0 |
| 0.8472222222222222 | 0 |
| 0.8479166666666668 | 0 |
| 0.8486111111111111 | 0 |
| 0.8493055555555555 | 0 |
| 0.85 | 0 |
| 0.8506944444444445 | 0 |
| 0.8513888888888889 | 0 |
| 0.8520833333333333 | 0 |
| 0.8527777777777777 | 0 |
| 0.8534722222222223 | 0 |
| 0.8541666666666666 | 0 |
| 0.8548611111111111 | 0 |
| 0.8555555555555556 | 0 |
| 0.8562500000000001 | 0 |
| 0.8569444444444444 | 0 |
| 0.8576388888888888 | 0 |
| 0.8583333333333334 | 0 |
| 0.8590277777777778 | 0 |
| 0.8597222222222222 | 0 |
| 0.8604166666666666 | 0 |
| 0.8611111111111112 | 0 |
| 0.8618055555555556 | 0 |
| 0.8624999999999999 | 0 |
| 0.8631944444444444 | 0 |
| 0.8638888888888889 | 0 |
| 0.8645833333333334 | 0 |
| 0.8652777777777777 | 0 |
| 0.8659722222222223 | 0 |
| 0.8666666666666667 | 0 |
| 0.8673611111111111 | 0 |
| 0.8680555555555555 | 0 |
| 0.86875 | 0 |
| 0.8694444444444445 | 0 |
| 0.8701388888888889 | 0 |
| 0.8708333333333332 | 0 |
| 0.8715277777777778 | 0 |
| 0.8722222222222222 | 0 |
| 0.8729166666666667 | 0 |
| 0.873611111111111 | 0 |
| 0.8743055555555556 | 0 |
| 0.875 | 0 |
| 0.8756944444444444 | 0 |
| 0.876388888888889 | 0 |
| 0.8770833333333333 | 0 |
| 0.8777777777777778 | 0 |
| 0.8784722222222222 | 0 |
| 0.8791666666666668 | 0 |
| 0.8798611111111111 | 0 |
| 0.8805555555555555 | 0 |
| 0.88125 | 0 |
| 0.8819444444444445 | 0 |
| 0.8826388888888889 | 0 |
| 0.8833333333333333 | 0 |
| 0.8840277777777777 | 0 |
| 0.8847222222222223 | 0 |
| 0.8854166666666666 | 0 |
| 0.8861111111111111 | 0 |
| 0.8868055555555556 | 0 |
| 0.8875000000000001 | 0 |
| 0.8881944444444444 | 0 |
| 0.8888888888888888 | 0 |
| 0.8895833333333334 | 0 |
| 0.8902777777777778 | 0 |
| 0.8909722222222222 | 0 |
| 0.8916666666666666 | 0 |
| 0.8923611111111112 | 0 |
| 0.8930555555555556 | 0 |
| 0.8937499999999999 | 0 |
| 0.8944444444444444 | 0 |
| 0.8951388888888889 | 0 |
| 0.8958333333333334 | 0 |
| 0.8965277777777777 | 0 |
| 0.8972222222222223 | 0 |
| 0.8979166666666667 | 0 |
| 0.8986111111111111 | 0 |
| 0.8993055555555555 | 0 |
| 0.9 | 0 |
| 0.9006944444444445 | 0 |
| 0.9013888888888889 | 0 |
| 0.9020833333333332 | 0 |
| 0.9027777777777778 | 0 |
| 0.9034722222222222 | 0 |
| 0.9041666666666667 | 0 |
| 0.904861111111111 | 0 |
| 0.9055555555555556 | 0 |
| 0.90625 | 0 |
| 0.9069444444444444 | 0 |
| 0.907638888888889 | 0 |
| 0.9083333333333333 | 0 |
| 0.9090277777777778 | 0 |
| 0.9097222222222222 | 0 |
| 0.9104166666666668 | 0 |
| 0.9111111111111111 | 0 |
| 0.9118055555555555 | 0 |
| 0.9125 | 0 |
| 0.9131944444444445 | 0 |
| 0.9138888888888889 | 0 |
| 0.9145833333333333 | 0 |
| 0.9152777777777777 | 0 |
| 0.9159722222222223 | 0 |
| 0.9166666666666666 | 0 |
| 0.9173611111111111 | 0 |
| 0.9180555555555556 | 0 |
| 0.9187500000000001 | 0 |
| 0.9194444444444444 | 0 |
| 0.9201388888888888 | 0 |
| 0.9208333333333334 | 0 |
| 0.9215277777777778 | 0 |
| 0.9222222222222222 | 0 |
| 0.9229166666666666 | 0 |
| 0.9236111111111112 | 0 |
| 0.9243055555555556 | 0 |
| 0.9249999999999999 | 0 |
| 0.9256944444444444 | 0 |
| 0.9263888888888889 | 0 |
| 0.9270833333333334 | 0 |
| 0.9277777777777777 | 0 |
| 0.9284722222222223 | 0 |
| 0.9291666666666667 | 0 |
| 0.9298611111111111 | 0 |
| 0.9305555555555555 | 0 |
| 0.93125 | 0 |
| 0.9319444444444445 | 0 |
| 0.9326388888888889 | 0 |
| 0.9333333333333332 | 0 |
| 0.9340277777777778 | 0 |
| 0.9347222222222222 | 0 |
| 0.9354166666666667 | 0 |
| 0.936111111111111 | 0 |
| 0.9368055555555556 | 0 |
| 0.9375 | 0 |
| 0.9381944444444444 | 0 |
| 0.938888888888889 | 0 |
| 0.9395833333333333 | 0 |
| 0.9402777777777778 | 0 |
| 0.9409722222222222 | 0 |
| 0.9416666666666668 | 0 |
| 0.9423611111111111 | 0 |
| 0.9430555555555555 | 0 |
| 0.94375 | 0 |
| 0.9444444444444445 | 0 |
| 0.9451388888888889 | 0 |
| 0.9458333333333333 | 0 |
| 0.9465277777777777 | 0 |
| 0.9472222222222223 | 0 |
| 0.9479166666666666 | 0 |
| 0.9486111111111111 | 0 |
| 0.9493055555555556 | 0 |
| 0.9500000000000001 | 0 |
| 0.9506944444444444 | 0 |
| 0.9513888888888888 | 0 |
| 0.9520833333333334 | 0 |
| 0.9527777777777778 | 0 |
| 0.9534722222222222 | 0 |
| 0.9541666666666666 | 0 |
| 0.9548611111111112 | 0 |
| 0.9555555555555556 | 0 |
| 0.9562499999999999 | 0 |
| 0.9569444444444444 | 0 |
| 0.9576388888888889 | 0 |
| 0.9583333333333334 | 0 |
| 0.9590277777777777 | 0 |
| 0.9597222222222223 | 0 |
| 0.9604166666666667 | 0 |
| 0.9611111111111111 | 0 |
| 0.9618055555555555 | 0 |
| 0.9625 | 0 |
| 0.9631944444444445 | 0 |
| 0.9638888888888889 | 0 |
| 0.9645833333333332 | 0 |
| 0.9652777777777778 | 0 |
| 0.9659722222222222 | 0 |
| 0.9666666666666667 | 0 |
| 0.967361111111111 | 0 |
| 0.9680555555555556 | 0 |
| 0.96875 | 0 |
| 0.9694444444444444 | 0 |
| 0.970138888888889 | 0 |
| 0.9708333333333333 | 0 |
| 0.9715277777777778 | 0 |
| 0.9722222222222222 | 0 |
| 0.9729166666666668 | 0 |
| 0.9736111111111111 | 0 |
| 0.9743055555555555 | 0 |
| 0.975 | 0 |
| 0.9756944444444445 | 0 |
| 0.9763888888888889 | 0 |
| 0.9770833333333333 | 0 |
| 0.9777777777777777 | 0 |
| 0.9784722222222223 | 0 |
| 0.9791666666666666 | 0 |
| 0.9798611111111111 | 0 |
| 0.9805555555555556 | 0 |
| 0.9812500000000001 | 0 |
| 0.9819444444444444 | 0 |
| 0.9826388888888888 | 0 |
| 0.9833333333333334 | 0 |
| 0.9840277777777778 | 0 |
| 0.9847222222222222 | 0 |
| 0.9854166666666666 | 0 |
| 0.9861111111111112 | 0 |
| 0.9868055555555556 | 0 |
| 0.9874999999999999 | 0 |
| 0.9881944444444444 | 0 |
| 0.9888888888888889 | 0 |
| 0.9895833333333334 | 0 |
| 0.9902777777777777 | 0 |
| 0.9909722222222223 | 0 |
| 0.9916666666666667 | 0 |
| 0.9923611111111111 | 0 |
| 0.9930555555555555 | 0 |
| 0.99375 | 0 |
| 0.9944444444444445 | 0 |
| 0.9951388888888889 | 0 |
| 0.9958333333333332 | 0 |
| 0.9965277777777778 | 0 |
| 0.9972222222222222 | 0 |
| 0.9979166666666667 | 0 |
| 0.998611111111111 | 0 |
| 0.9993055555555556 | 0 |